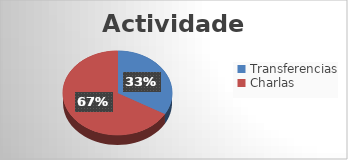
| Category | Series 0 |
|---|---|
| Transferencias | 1 |
| Charlas | 2 |